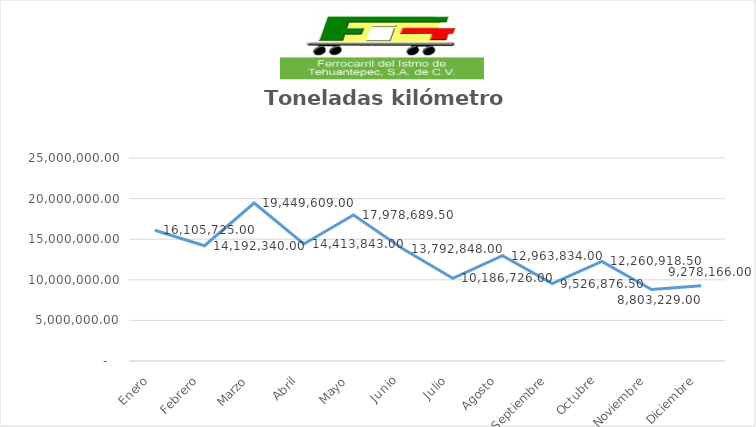
| Category | Series 0 |
|---|---|
| Enero | 16105725 |
| Febrero | 14192340 |
| Marzo | 19449609 |
| Abril | 14413843 |
| Mayo | 17978689.5 |
| Junio | 13792848 |
| Julio | 10186726 |
| Agosto | 12963834 |
| Septiembre | 9526876.5 |
| Octubre | 12260918.5 |
| Noviembre | 8803229 |
| Diciembre | 9278166 |